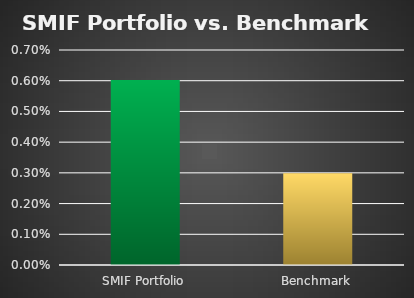
| Category | Series 0 |
|---|---|
| SMIF Portfolio | 0.006 |
| Benchmark | 0.003 |